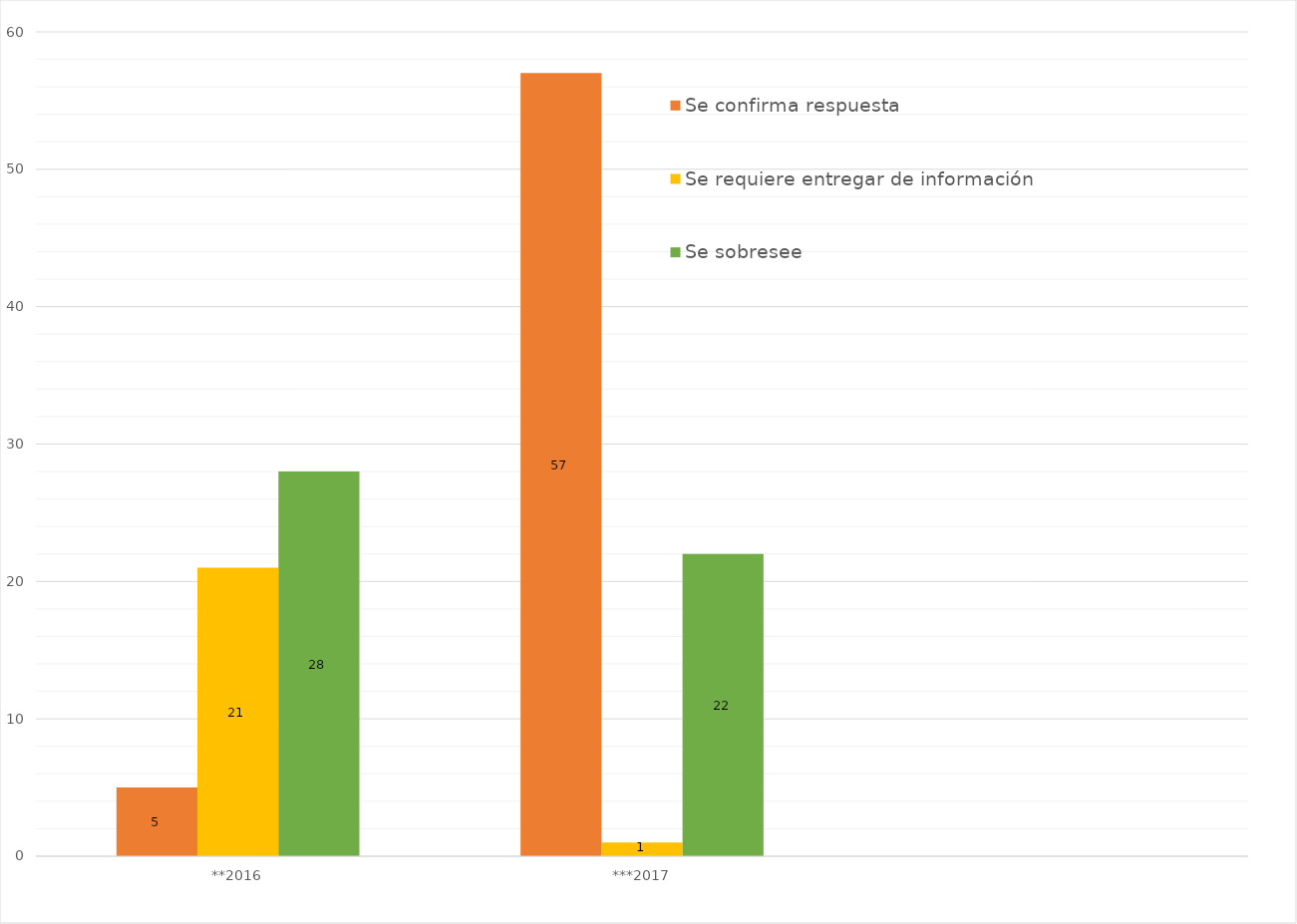
| Category | Se confirma respuesta | Se requiere entregar de información  | Se sobresee  |
|---|---|---|---|
| **2016 | 5 | 21 | 28 |
| ***2017 | 57 | 1 | 22 |